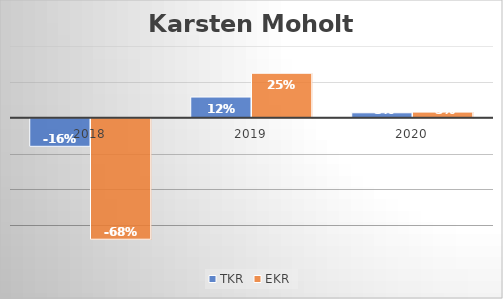
| Category | TKR | EKR |
|---|---|---|
| 2018.0 | -0.157 | -0.676 |
| 2019.0 | 0.115 | 0.248 |
| 2020.0 | 0.027 | 0.031 |